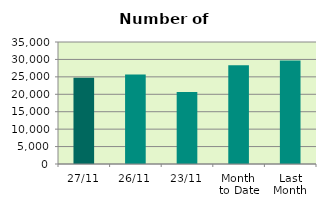
| Category | Series 0 |
|---|---|
| 27/11 | 24718 |
| 26/11 | 25644 |
| 23/11 | 20660 |
| Month 
to Date | 28304.316 |
| Last
Month | 29672.087 |